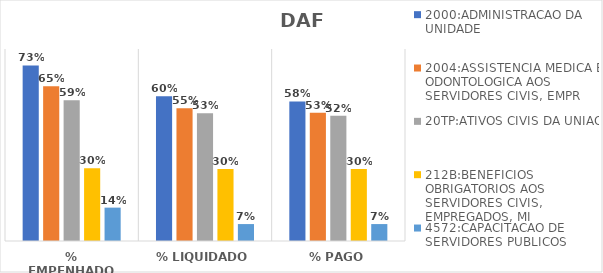
| Category | 2000:ADMINISTRACAO DA UNIDADE | 2004:ASSISTENCIA MEDICA E ODONTOLOGICA AOS SERVIDORES CIVIS, EMPR | 20TP:ATIVOS CIVIS DA UNIAO | 212B:BENEFICIOS OBRIGATORIOS AOS SERVIDORES CIVIS, EMPREGADOS, MI | 4572:CAPACITACAO DE SERVIDORES PUBLICOS FEDERAIS EM PROCESSO DE Q |
|---|---|---|---|---|---|
| % EMPENHADO | 0.731 | 0.645 | 0.587 | 0.303 | 0.139 |
| % LIQUIDADO | 0.603 | 0.553 | 0.532 | 0.3 | 0.071 |
| % PAGO | 0.581 | 0.534 | 0.522 | 0.3 | 0.071 |